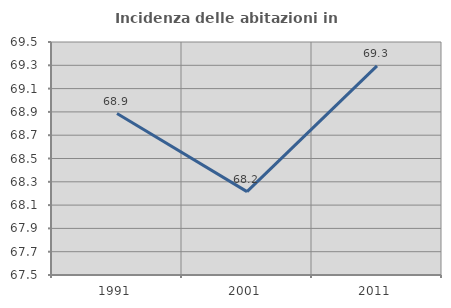
| Category | Incidenza delle abitazioni in proprietà  |
|---|---|
| 1991.0 | 68.886 |
| 2001.0 | 68.215 |
| 2011.0 | 69.295 |